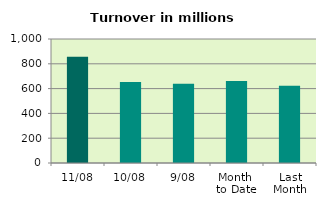
| Category | Series 0 |
|---|---|
| 11/08 | 857.446 |
| 10/08 | 653.32 |
| 9/08 | 639.953 |
| Month 
to Date | 661.424 |
| Last
Month | 622.259 |